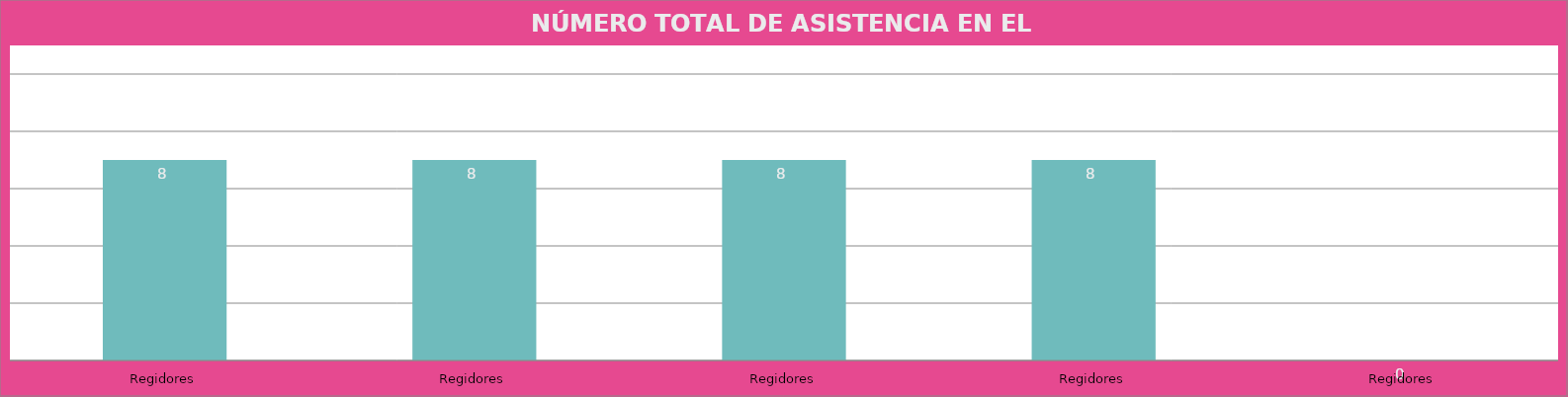
| Category | Regidores |
|---|---|
| Regidores | 8 |
| Regidores | 8 |
| Regidores | 8 |
| Regidores | 8 |
| Regidores | 0 |